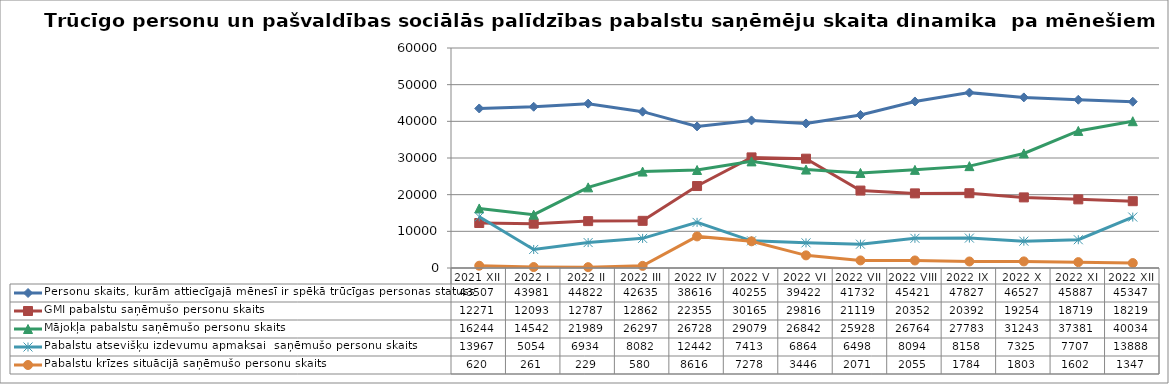
| Category | Personu skaits, kurām attiecīgajā mēnesī ir spēkā trūcīgas personas statuss | GMI pabalstu saņēmušo personu skaits | Mājokļa pabalstu saņēmušo personu skaits | Pabalstu atsevišķu izdevumu apmaksai  saņēmušo personu skaits | Pabalstu krīzes situācijā saņēmušo personu skaits |
|---|---|---|---|---|---|
| 2021 XII | 43507 | 12271 | 16244 | 13967 | 620 |
| 2022 I | 43981 | 12093 | 14542 | 5054 | 261 |
| 2022 II | 44822 | 12787 | 21989 | 6934 | 229 |
| 2022 III | 42635 | 12862 | 26297 | 8082 | 580 |
| 2022 IV | 38616 | 22355 | 26728 | 12442 | 8616 |
| 2022 V | 40255 | 30165 | 29079 | 7413 | 7278 |
| 2022 VI | 39422 | 29816 | 26842 | 6864 | 3446 |
| 2022 VII | 41732 | 21119 | 25928 | 6498 | 2071 |
| 2022 VIII | 45421 | 20352 | 26764 | 8094 | 2055 |
| 2022 IX | 47827 | 20392 | 27783 | 8158 | 1784 |
| 2022 X | 46527 | 19254 | 31243 | 7325 | 1803 |
| 2022 XI | 45887 | 18719 | 37381 | 7707 | 1602 |
| 2022 XII | 45347 | 18219 | 40034 | 13888 | 1347 |